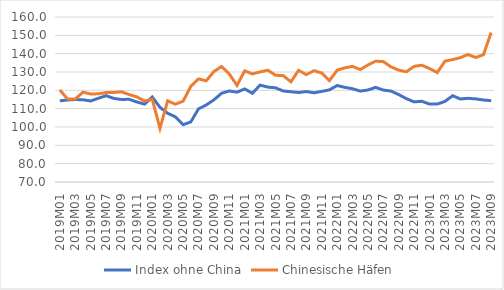
| Category | Index ohne China | Chinesische Häfen |
|---|---|---|
| 2019M01 | 114.283 | 120.157 |
| 2019M02 | 114.731 | 115.296 |
| 2019M03 | 114.988 | 115.295 |
| 2019M04 | 114.855 | 118.965 |
| 2019M05 | 114.206 | 118.018 |
| 2019M06 | 115.673 | 118.09 |
| 2019M07 | 117.086 | 118.802 |
| 2019M08 | 115.613 | 118.84 |
| 2019M09 | 115.009 | 119.197 |
| 2019M10 | 115.101 | 117.694 |
| 2019M11 | 113.64 | 116.416 |
| 2019M12 | 112.494 | 114.204 |
| 2020M01 | 116.351 | 115.103 |
| 2020M02 | 110.75 | 99.268 |
| 2020M03 | 107.481 | 114.299 |
| 2020M04 | 105.551 | 112.434 |
| 2020M05 | 101.259 | 114.062 |
| 2020M06 | 102.758 | 122.194 |
| 2020M07 | 109.882 | 126.225 |
| 2020M08 | 111.988 | 125.193 |
| 2020M09 | 114.793 | 130.226 |
| 2020M10 | 118.409 | 132.986 |
| 2020M11 | 119.647 | 128.891 |
| 2020M12 | 119.009 | 122.69 |
| 2021M01 | 120.749 | 130.632 |
| 2021M02 | 118.417 | 128.952 |
| 2021M03 | 122.836 | 130.05 |
| 2021M04 | 121.782 | 130.984 |
| 2021M05 | 121.369 | 128.235 |
| 2021M06 | 119.657 | 128.056 |
| 2021M07 | 119.225 | 124.641 |
| 2021M08 | 118.811 | 130.908 |
| 2021M09 | 119.33 | 128.578 |
| 2021M10 | 118.667 | 130.691 |
| 2021M11 | 119.417 | 129.459 |
| 2021M12 | 120.251 | 125.308 |
| 2022M01 | 122.624 | 130.97 |
| 2022M02 | 121.631 | 132.273 |
| 2022M03 | 120.871 | 133.051 |
| 2022M04 | 119.583 | 131.326 |
| 2022M05 | 120.181 | 133.821 |
| 2022M06 | 121.63 | 135.887 |
| 2022M07 | 120.138 | 135.66 |
| 2022M08 | 119.6 | 132.788 |
| 2022M09 | 117.684 | 131.04 |
| 2022M10 | 115.446 | 130.12 |
| 2022M11 | 113.701 | 133.09 |
| 2022M12 | 114.024 | 133.691 |
| 2023M01 | 112.508 | 131.888 |
| 2023M02 | 112.517 | 129.684 |
| 2023M03 | 113.949 | 135.897 |
| 2023M04 | 117.071 | 136.783 |
| 2023M05 | 115.29 | 137.835 |
| 2023M06 | 115.644 | 139.531 |
| 2023M07 | 115.34 | 137.911 |
| 2023M08 | 114.722 | 139.418 |
| 2023M09 | 114.356 | 151.525 |